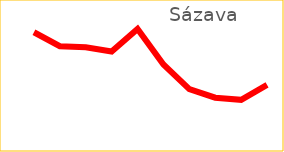
| Category | Sázava |
|---|---|
| 2010 | 3783 |
| 2011 | 3770 |
| 2012 | 3769 |
| 2013 | 3765 |
| 2014 | 3786 |
| 2015 | 3753 |
| 2016 | 3730 |
| 2017 | 3722 |
| 2018 | 3720 |
| 2019 | 3734 |